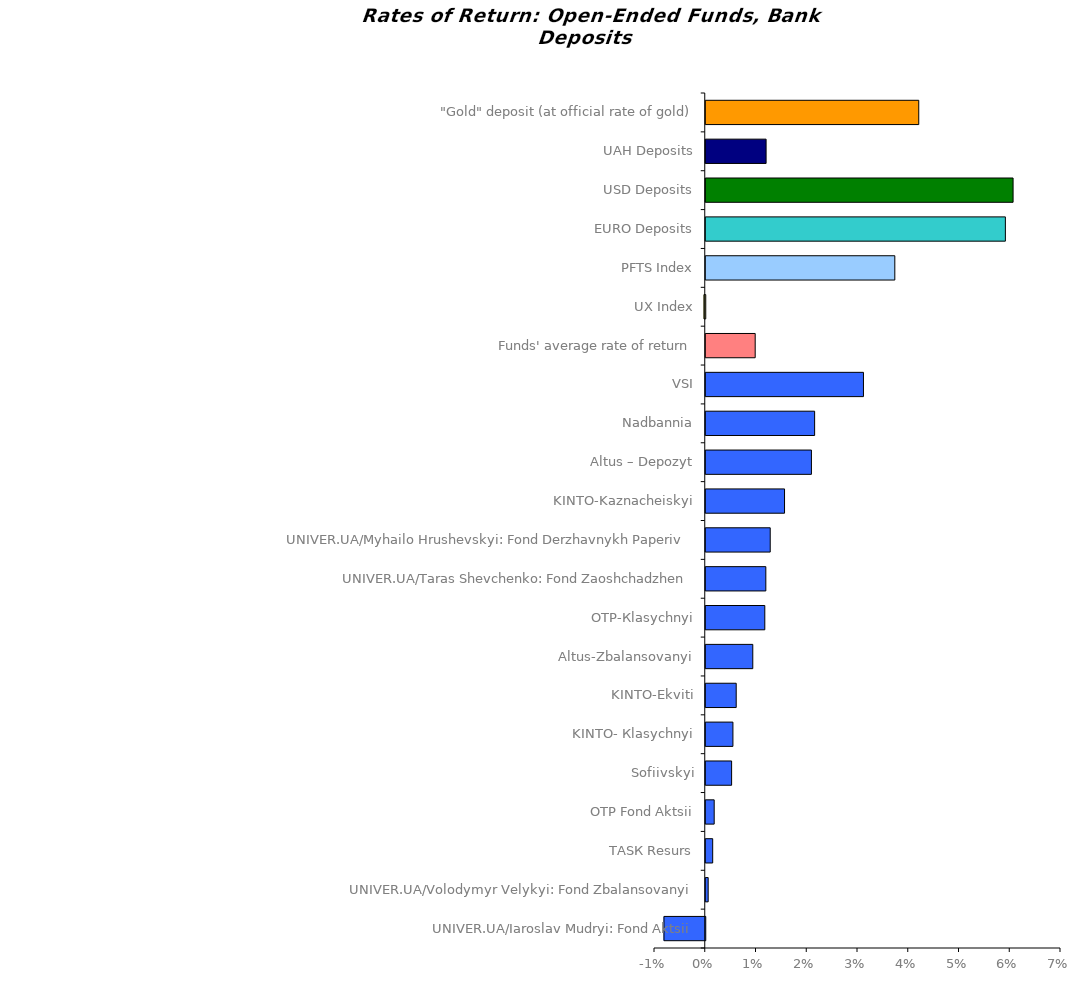
| Category | Series 0 |
|---|---|
| UNIVER.UA/Iaroslav Mudryi: Fond Aktsii | -0.008 |
| UNIVER.UA/Volodymyr Velykyi: Fond Zbalansovanyi | 0 |
| ТАSК Resurs | 0.001 |
| ОТP Fond Aktsii | 0.002 |
| Sofiivskyi | 0.005 |
| KINTO- Кlasychnyi | 0.005 |
| KINTO-Ekviti | 0.006 |
| Аltus-Zbalansovanyi | 0.009 |
| OTP-Кlasychnyi | 0.012 |
| UNIVER.UA/Taras Shevchenko: Fond Zaoshchadzhen | 0.012 |
| UNIVER.UA/Myhailo Hrushevskyi: Fond Derzhavnykh Paperiv    | 0.013 |
| KINTO-Kaznacheiskyi | 0.016 |
| Altus – Depozyt | 0.021 |
| Nadbannia | 0.021 |
| VSI | 0.031 |
| Funds' average rate of return | 0.01 |
| UX Index | 0 |
| PFTS Index | 0.037 |
| EURO Deposits | 0.059 |
| USD Deposits | 0.061 |
| UAH Deposits | 0.012 |
| "Gold" deposit (at official rate of gold) | 0.042 |